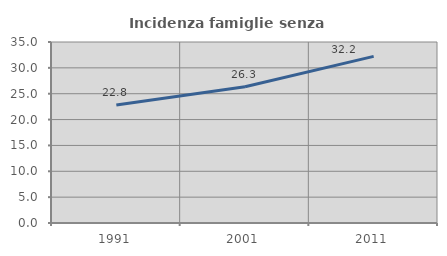
| Category | Incidenza famiglie senza nuclei |
|---|---|
| 1991.0 | 22.815 |
| 2001.0 | 26.344 |
| 2011.0 | 32.219 |